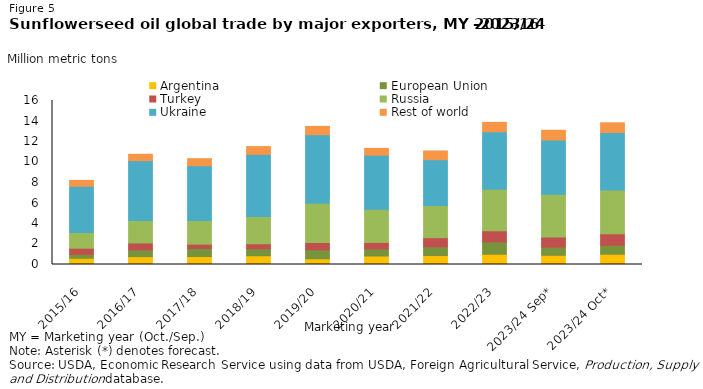
| Category | Argentina                      | European Union                 | Turkey                         | Russia                         | Ukraine                        | Rest of world |
|---|---|---|---|---|---|---|
| 2015/16 | 0.605 | 0.374 | 0.613 | 1.541 | 4.5 | 0.573 |
| 2016/17 | 0.766 | 0.653 | 0.685 | 2.178 | 5.851 | 0.619 |
| 2017/18 | 0.783 | 0.787 | 0.418 | 2.31 | 5.342 | 0.684 |
| 2018/19 | 0.854 | 0.678 | 0.496 | 2.652 | 6.063 | 0.761 |
| 2019/20 | 0.558 | 0.875 | 0.715 | 3.83 | 6.686 | 0.807 |
| 2020/21 | 0.829 | 0.683 | 0.639 | 3.246 | 5.273 | 0.657 |
| 2021/22 | 0.873 | 0.852 | 0.889 | 3.15 | 4.465 | 0.849 |
| 2022/23 | 1 | 1.2 | 1.102 | 4.05 | 5.6 | 0.915 |
| 2023/24 Sep* | 0.9 | 0.8 | 0.975 | 4.175 | 5.3 | 0.949 |
| 2023/24 Oct* | 1 | 0.875 | 1.125 | 4.275 | 5.6 | 0.949 |